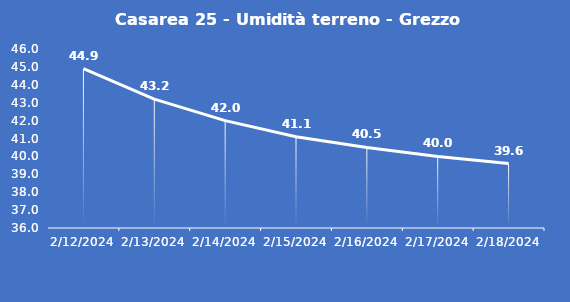
| Category | Casarea 25 - Umidità terreno - Grezzo (%VWC) |
|---|---|
| 2/12/24 | 44.9 |
| 2/13/24 | 43.2 |
| 2/14/24 | 42 |
| 2/15/24 | 41.1 |
| 2/16/24 | 40.5 |
| 2/17/24 | 40 |
| 2/18/24 | 39.6 |